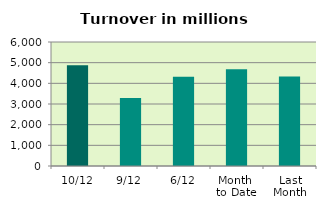
| Category | Series 0 |
|---|---|
| 10/12 | 4873.401 |
| 9/12 | 3288.976 |
| 6/12 | 4312.944 |
| Month 
to Date | 4686.206 |
| Last
Month | 4332.538 |